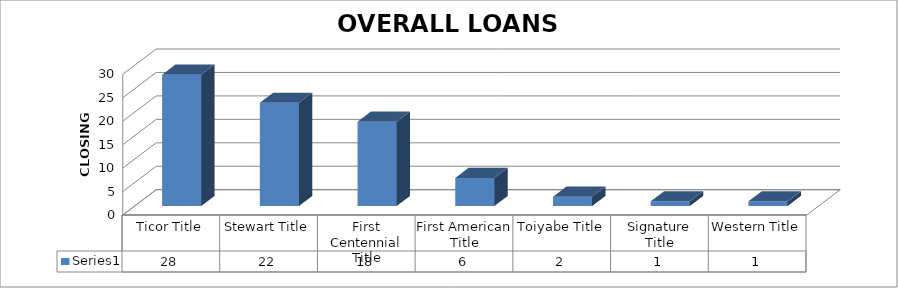
| Category | Series 0 |
|---|---|
| Ticor Title | 28 |
| Stewart Title | 22 |
| First Centennial Title | 18 |
| First American Title | 6 |
| Toiyabe Title | 2 |
| Signature Title | 1 |
| Western Title | 1 |